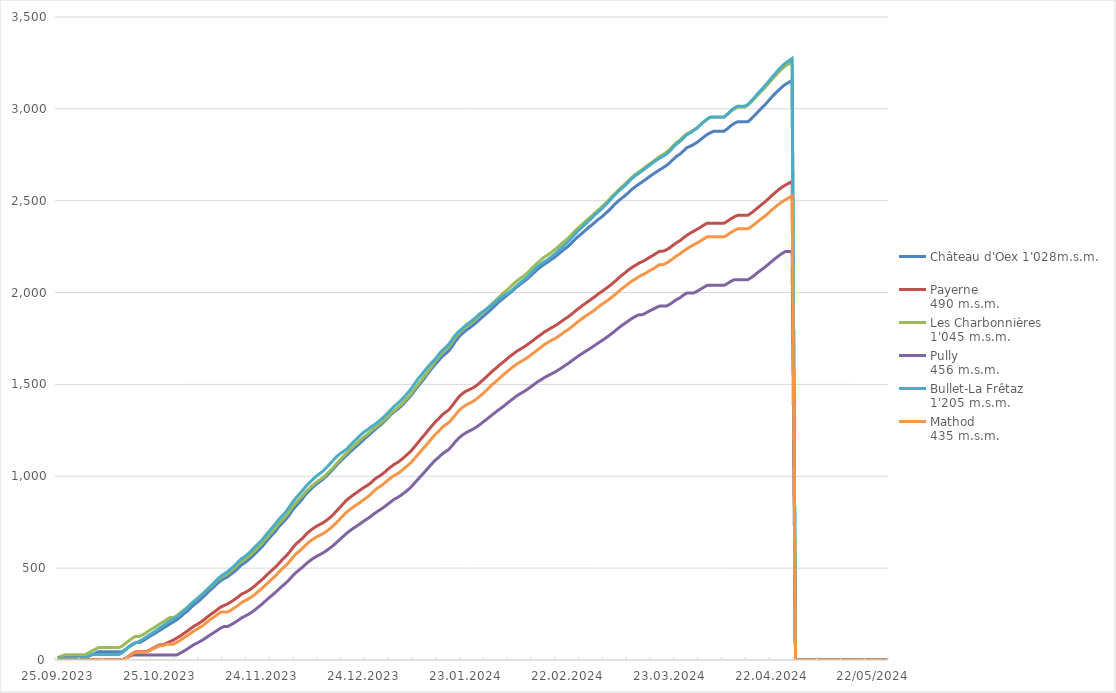
| Category | Château d'Oex 1'028m.s.m. | Payerne 
490 m.s.m. | Les Charbonnières 
1'045 m.s.m. | Pully 
456 m.s.m. | Bullet-La Frêtaz 
1'205 m.s.m. | Mathod 
435 m.s.m. |
|---|---|---|---|---|---|---|
| 25.09.2023 | 10.8 | 0 | 10.6 | 0 | 9.9 | 0 |
| 26.09.2023 | 19.4 | 0 | 19.9 | 0 | 9.9 | 0 |
| 27.09.2023 | 19.4 | 0 | 27.9 | 0 | 9.9 | 0 |
| 28.09.2023 | 19.4 | 0 | 27.9 | 0 | 9.9 | 0 |
| 29.09.2023 | 19.4 | 0 | 27.9 | 0 | 9.9 | 0 |
| 30.09.2023 | 19.4 | 0 | 27.9 | 0 | 9.9 | 0 |
| 01.10.2023 | 19.4 | 0 | 27.9 | 0 | 9.9 | 0 |
| 02.10.2023 | 19.4 | 0 | 27.9 | 0 | 9.9 | 0 |
| 03.10.2023 | 19.4 | 0 | 27.9 | 0 | 9.9 | 0 |
| 04.10.2023 | 19.4 | 0 | 38.4 | 0 | 20.1 | 0 |
| 05.10.2023 | 28.1 | 0 | 48.5 | 0 | 29.7 | 0 |
| 06.10.2023 | 36.7 | 0 | 58.1 | 0 | 29.7 | 0 |
| 07.10.2023 | 44.9 | 0 | 67.6 | 0 | 29.7 | 0 |
| 08.10.2023 | 44.9 | 0 | 67.6 | 0 | 29.7 | 0 |
| 09.10.2023 | 44.9 | 0 | 67.6 | 0 | 29.7 | 0 |
| 10.10.2023 | 44.9 | 0 | 67.6 | 0 | 29.7 | 0 |
| 11.10.2023 | 44.9 | 0 | 67.6 | 0 | 29.7 | 0 |
| 12.10.2023 | 44.9 | 0 | 67.6 | 0 | 29.7 | 0 |
| 13.10.2023 | 44.9 | 0 | 67.6 | 0 | 29.7 | 0 |
| 14.10.2023 | 44.9 | 0 | 76 | 0 | 39.4 | 0 |
| 15.10.2023 | 58.2 | 9.6 | 90.5 | 8.5 | 55 | 9 |
| 16.10.2023 | 73.2 | 22.5 | 106 | 19.1 | 71.7 | 20.8 |
| 17.10.2023 | 85.8 | 35.3 | 119.6 | 27.6 | 83.3 | 33.4 |
| 18.10.2023 | 95 | 45 | 128.4 | 27.6 | 92.9 | 42.3 |
| 19.10.2023 | 95 | 45 | 128.4 | 27.6 | 101.8 | 42.3 |
| 20.10.2023 | 104.3 | 45 | 137.3 | 27.6 | 112.2 | 42.3 |
| 21.10.2023 | 115.2 | 45 | 148.6 | 27.6 | 124.2 | 42.3 |
| 22.10.2023 | 128 | 53.7 | 161.3 | 27.6 | 137.3 | 50.9 |
| 23.10.2023 | 138.2 | 64.1 | 172.4 | 27.6 | 148.6 | 60.4 |
| 24.10.2023 | 149.7 | 73.2 | 184.1 | 27.6 | 161.2 | 68.8 |
| 25.10.2023 | 161.7 | 82.6 | 196.1 | 27.6 | 174.4 | 77.8 |
| 26.10.2023 | 172.6 | 82.6 | 206.7 | 27.6 | 186.3 | 77.8 |
| 27.10.2023 | 184.7 | 91.3 | 219.6 | 27.6 | 200.5 | 86 |
| 28.10.2023 | 196.2 | 99.8 | 230.9 | 27.6 | 212.7 | 86 |
| 29.10.2023 | 207.2 | 108.3 | 230.9 | 27.6 | 222.3 | 86 |
| 30.10.2023 | 219.2 | 119.4 | 241.4 | 27.6 | 234.1 | 96.4 |
| 31.10.2023 | 233.5 | 130.1 | 255.9 | 36.8 | 249.4 | 106.8 |
| 01.11.2023 | 249.7 | 143.5 | 270.9 | 47.8 | 265 | 120.1 |
| 02.11.2023 | 264.2 | 156 | 284.8 | 58.3 | 280.7 | 131.7 |
| 03.11.2023 | 281.8 | 169.6 | 302.9 | 70.9 | 299.9 | 144.8 |
| 04.11.2023 | 299.4 | 183.1 | 318.8 | 82.9 | 317.5 | 157.4 |
| 05.11.2023 | 313.8 | 193.9 | 333.1 | 92.2 | 333.1 | 167.6 |
| 06.11.2023 | 329.3 | 205.5 | 348.6 | 102.1 | 349.3 | 178.8 |
| 07.11.2023 | 347 | 218.7 | 366 | 113.3 | 367.3 | 192.4 |
| 08.11.2023 | 365.6 | 233.9 | 382.8 | 126.2 | 384.8 | 208 |
| 09.11.2023 | 382.7 | 248.2 | 397.8 | 138.4 | 402 | 221.9 |
| 10.11.2023 | 399.3 | 260.9 | 415 | 149.8 | 420.3 | 234 |
| 11.11.2023 | 417 | 275.2 | 433.6 | 162.3 | 440 | 248.1 |
| 12.11.2023 | 432.9 | 288.9 | 448.8 | 174.2 | 456.9 | 261.2 |
| 13.11.2023 | 443.8 | 297.2 | 459.2 | 182.8 | 468.9 | 261.2 |
| 14.11.2023 | 453.4 | 305.6 | 470 | 182.8 | 481.5 | 261.2 |
| 15.11.2023 | 467.7 | 316.9 | 485.5 | 192.1 | 497.5 | 271.8 |
| 16.11.2023 | 481.8 | 329.2 | 500.8 | 203 | 513.8 | 284.1 |
| 17.11.2023 | 498.4 | 342 | 518.5 | 214.4 | 532.8 | 296.3 |
| 18.11.2023 | 516.8 | 357.8 | 535.4 | 228.3 | 550.5 | 311.7 |
| 19.11.2023 | 529.4 | 366.4 | 546.7 | 238.2 | 562.7 | 321.8 |
| 20.11.2023 | 543.7 | 376.6 | 560.9 | 247.8 | 578.2 | 331.4 |
| 21.11.2023 | 560 | 389.2 | 577.7 | 259.4 | 596.2 | 343.2 |
| 22.11.2023 | 577.1 | 403.8 | 595.5 | 272.7 | 615.8 | 356.6 |
| 23.11.2023 | 596.2 | 420.6 | 614.4 | 287.9 | 632.4 | 373.1 |
| 24.11.2023 | 614.2 | 435.7 | 632.9 | 302.7 | 651.4 | 388.8 |
| 25.11.2023 | 636.1 | 453.4 | 655.1 | 319.5 | 674.6 | 405.6 |
| 26.11.2023 | 659.6 | 471.5 | 677 | 336.1 | 697.2 | 423.7 |
| 27.11.2023 | 679.6 | 488.5 | 697.6 | 351.7 | 718.3 | 441 |
| 28.11.2023 | 699.2 | 504.9 | 718.4 | 367.1 | 740.3 | 457.1 |
| 29.11.2023 | 724.5 | 524.8 | 742.7 | 385 | 764.8 | 476.9 |
| 30.11.2023 | 744.4 | 544.5 | 761.8 | 401.7 | 784.6 | 495.8 |
| 01.12.2023 | 763.8 | 562.9 | 781.2 | 417.1 | 804.6 | 513.1 |
| 02.12.2023 | 786.1 | 583.2 | 805.1 | 435.5 | 829.7 | 532 |
| 03.12.2023 | 813.9 | 607.4 | 832.7 | 455.8 | 857.2 | 554.1 |
| 04.12.2023 | 836.8 | 629.8 | 854 | 474.9 | 880.5 | 575.4 |
| 05.12.2023 | 856 | 646.1 | 873.7 | 489.9 | 901.4 | 591.6 |
| 06.12.2023 | 878.1 | 662.5 | 894 | 505.1 | 923.1 | 608.1 |
| 07.12.2023 | 902.9 | 682.7 | 916.1 | 522.4 | 945.3 | 626.7 |
| 08.12.2023 | 922.1 | 700 | 934.1 | 537.8 | 964.3 | 643.3 |
| 09.12.2023 | 939.8 | 714.5 | 951.2 | 551.4 | 982.5 | 656.9 |
| 10.12.2023 | 956.4 | 726.6 | 966.9 | 562.6 | 999.4 | 668.4 |
| 11.12.2023 | 969 | 736.8 | 979.6 | 572.7 | 1013.8 | 678.1 |
| 12.12.2023 | 983.4 | 746.4 | 992.3 | 582.4 | 1028 | 687.4 |
| 13.12.2023 | 1000.9 | 759.5 | 1009.4 | 594.7 | 1046.2 | 699.8 |
| 14.12.2023 | 1019.5 | 773.7 | 1028.2 | 608.2 | 1065.9 | 713.6 |
| 15.12.2023 | 1038.6 | 790.9 | 1047.7 | 622.6 | 1086.6 | 730.3 |
| 16.12.2023 | 1059.8 | 811.3 | 1067.9 | 639.3 | 1106.9 | 748.8 |
| 17.12.2023 | 1079.1 | 830.7 | 1087.8 | 656.5 | 1122 | 767.3 |
| 18.12.2023 | 1097.2 | 850.9 | 1108 | 673.1 | 1134.9 | 787 |
| 19.12.2023 | 1114.7 | 870.5 | 1127 | 689.8 | 1148.5 | 805.2 |
| 20.12.2023 | 1132.5 | 885.7 | 1146 | 704.4 | 1168.4 | 820.2 |
| 21.12.2023 | 1149.6 | 899.4 | 1163.4 | 717.8 | 1186.8 | 833.6 |
| 22.12.2023 | 1165.4 | 912.1 | 1179.9 | 729.5 | 1204.6 | 845.7 |
| 23.12.2023 | 1182.4 | 925.7 | 1197.8 | 742.3 | 1223.5 | 858.9 |
| 24.12.2023 | 1200.4 | 938.6 | 1213 | 755.9 | 1239.6 | 872.8 |
| 25.12.2023 | 1215.5 | 949.3 | 1227.3 | 767.5 | 1252.3 | 885.6 |
| 26.12.2023 | 1232.3 | 962.7 | 1243.7 | 780.5 | 1266.2 | 901 |
| 27.12.2023 | 1249.1 | 981.1 | 1260.4 | 795.5 | 1278.9 | 919.9 |
| 28.12.2023 | 1265.9 | 994.1 | 1274.2 | 808.2 | 1292.6 | 935.4 |
| 29.12.2023 | 1279.7 | 1005.2 | 1288.6 | 819.8 | 1308.3 | 946.8 |
| 30.12.2023 | 1297.2 | 1019.4 | 1305.5 | 832.9 | 1324.7 | 961.1 |
| 31.12.2023 | 1315.8 | 1036.7 | 1322.5 | 847.1 | 1343.3 | 977 |
| 01.01.2024 | 1335.6 | 1051.6 | 1341.5 | 861.2 | 1362.9 | 991.8 |
| 02.01.2024 | 1352.3 | 1065.4 | 1358.4 | 875.1 | 1380.9 | 1004.8 |
| 03.01.2024 | 1365.2 | 1075.8 | 1373.1 | 885.1 | 1396.7 | 1014.7 |
| 04.01.2024 | 1381.7 | 1089.1 | 1390.5 | 897.1 | 1414.8 | 1028 |
| 05.01.2024 | 1400.9 | 1105.5 | 1408.3 | 911 | 1433.5 | 1044.3 |
| 06.01.2024 | 1421 | 1121.7 | 1428.6 | 926.1 | 1455 | 1059.7 |
| 07.01.2024 | 1441.4 | 1139.2 | 1449.7 | 942.7 | 1477.3 | 1076.1 |
| 08.01.2024 | 1466 | 1161.4 | 1475.6 | 963.9 | 1504.5 | 1097.6 |
| 09.01.2024 | 1490.8 | 1184 | 1501.4 | 984.7 | 1531.1 | 1119.4 |
| 10.01.2024 | 1512.9 | 1206.6 | 1524 | 1004.4 | 1552.8 | 1140.5 |
| 11.01.2024 | 1537.1 | 1228.4 | 1548.7 | 1025.2 | 1576.1 | 1161.2 |
| 12.01.2024 | 1562.8 | 1251 | 1572.4 | 1046.4 | 1598.6 | 1182.7 |
| 13.01.2024 | 1587 | 1273.4 | 1598.6 | 1067 | 1619.2 | 1205.3 |
| 14.01.2024 | 1608.7 | 1294.7 | 1624.2 | 1086.5 | 1637.8 | 1226.7 |
| 15.01.2024 | 1628.7 | 1312.2 | 1646.9 | 1102.4 | 1661.3 | 1244.2 |
| 16.01.2024 | 1650.9 | 1332.5 | 1672.2 | 1119.7 | 1683.8 | 1264.3 |
| 17.01.2024 | 1665.7 | 1347.8 | 1687 | 1133 | 1699.6 | 1279.5 |
| 18.01.2024 | 1682.1 | 1361.3 | 1704 | 1145.9 | 1718 | 1292.2 |
| 19.01.2024 | 1706.8 | 1383.3 | 1729.4 | 1166.5 | 1744.5 | 1312.2 |
| 20.01.2024 | 1734.5 | 1408.7 | 1755.4 | 1189 | 1769.4 | 1334.8 |
| 21.01.2024 | 1758.5 | 1432.9 | 1779.3 | 1208.7 | 1788.7 | 1357.3 |
| 22.01.2024 | 1776.8 | 1449.7 | 1795.6 | 1223.9 | 1804.5 | 1374.2 |
| 23.01.2024 | 1793.1 | 1462.4 | 1812.5 | 1236.2 | 1822.1 | 1386.9 |
| 24.01.2024 | 1806.1 | 1470.9 | 1825.4 | 1245.8 | 1835.7 | 1396.9 |
| 25.01.2024 | 1819.9 | 1479.8 | 1838.7 | 1255.1 | 1849.9 | 1406 |
| 26.01.2024 | 1835.1 | 1491.3 | 1854 | 1266.1 | 1864.8 | 1417.9 |
| 27.01.2024 | 1851.2 | 1506.7 | 1872.2 | 1279.2 | 1882.4 | 1433.4 |
| 28.01.2024 | 1868.3 | 1522.7 | 1890.6 | 1293.6 | 1896 | 1449 |
| 29.01.2024 | 1884.2 | 1540 | 1907.3 | 1308.2 | 1908.6 | 1466.5 |
| 30.01.2024 | 1900.6 | 1557.3 | 1925.2 | 1322.5 | 1922.3 | 1484.1 |
| 31.01.2024 | 1917.6 | 1574.7 | 1943.7 | 1337.3 | 1936.5 | 1502.5 |
| 01.02.2024 | 1935.6 | 1589.9 | 1960.7 | 1351.7 | 1952.8 | 1518 |
| 02.02.2024 | 1952.9 | 1606 | 1978 | 1365.5 | 1968.5 | 1534.6 |
| 03.02.2024 | 1967.8 | 1621.4 | 1995.4 | 1379.3 | 1980.4 | 1551 |
| 04.02.2024 | 1982.7 | 1636.6 | 2012 | 1393.8 | 1992.2 | 1566.6 |
| 05.02.2024 | 1997.8 | 1652.3 | 2028.5 | 1409.3 | 2003.8 | 1582.3 |
| 06.02.2024 | 2013.6 | 1666.1 | 2046.5 | 1423.3 | 2019.4 | 1596.7 |
| 07.02.2024 | 2030.7 | 1679.9 | 2062.8 | 1437.4 | 2037.4 | 1610.6 |
| 08.02.2024 | 2044.7 | 1691.2 | 2076.1 | 1449.2 | 2052.6 | 1621.9 |
| 09.02.2024 | 2058.2 | 1702 | 2089.4 | 1459.7 | 2067.4 | 1632.5 |
| 10.02.2024 | 2072.8 | 1714.7 | 2104.6 | 1471.5 | 2083.1 | 1644.5 |
| 11.02.2024 | 2089.8 | 1728.4 | 2123 | 1485.1 | 2102.6 | 1658.1 |
| 12.02.2024 | 2106.9 | 1742 | 2141.2 | 1498.5 | 2121.5 | 1671.5 |
| 13.02.2024 | 2124.5 | 1756.8 | 2159.9 | 1512 | 2139.8 | 1686.4 |
| 14.02.2024 | 2138.9 | 1769.5 | 2175.7 | 1523.7 | 2153.7 | 1700.2 |
| 15.02.2024 | 2152.7 | 1783.8 | 2192 | 1535.8 | 2166.4 | 1715.4 |
| 16.02.2024 | 2165 | 1795 | 2203.1 | 1545.9 | 2178 | 1726.7 |
| 17.02.2024 | 2177.7 | 1806 | 2216.6 | 1555.2 | 2191.8 | 1737.6 |
| 18.02.2024 | 2190.1 | 1816.3 | 2230.8 | 1564.8 | 2207 | 1747.4 |
| 19.02.2024 | 2204.6 | 1827.4 | 2245.6 | 1575.7 | 2223.1 | 1758.1 |
| 20.02.2024 | 2221.1 | 1840.7 | 2262.9 | 1587.7 | 2241.5 | 1770.7 |
| 21.02.2024 | 2236.3 | 1854.4 | 2278.9 | 1600.4 | 2257.6 | 1785.4 |
| 22.02.2024 | 2249.4 | 1866 | 2294 | 1612.1 | 2274.3 | 1796.4 |
| 23.02.2024 | 2267.3 | 1880.7 | 2313.3 | 1625.9 | 2294.7 | 1810.9 |
| 24.02.2024 | 2285.9 | 1895.7 | 2332.6 | 1639.4 | 2314.9 | 1826.3 |
| 25.02.2024 | 2303.9 | 1910.9 | 2350.3 | 1653 | 2334.1 | 1841.6 |
| 26.02.2024 | 2319.3 | 1924.6 | 2366.3 | 1665.3 | 2352 | 1855.3 |
| 27.02.2024 | 2335.9 | 1938.7 | 2384 | 1677.3 | 2369.9 | 1869 |
| 28.02.2024 | 2351.6 | 1951.3 | 2400.4 | 1688.8 | 2387.7 | 1880.8 |
| 29.02.2024 | 2366.5 | 1964.4 | 2416.1 | 1700.6 | 2404.9 | 1893.3 |
| 01.03.2024 | 2382.6 | 1977.8 | 2433.5 | 1713 | 2422.7 | 1906.5 |
| 02.03.2024 | 2398.4 | 1992.9 | 2449.3 | 1725.7 | 2439.6 | 1922.3 |
| 03.03.2024 | 2412.1 | 2005.7 | 2466.2 | 1737.6 | 2455.7 | 1935.3 |
| 04.03.2024 | 2428.4 | 2018.6 | 2484.2 | 1750.4 | 2474.3 | 1947.8 |
| 05.03.2024 | 2445.3 | 2032 | 2502.6 | 1763.5 | 2493.5 | 1961 |
| 06.03.2024 | 2464.3 | 2046.8 | 2522 | 1777.8 | 2514 | 1975.2 |
| 07.03.2024 | 2483.4 | 2062.6 | 2540.8 | 1792.4 | 2534.8 | 1990 |
| 08.03.2024 | 2500.8 | 2080 | 2559.4 | 1808 | 2552.6 | 2006.7 |
| 09.03.2024 | 2515.3 | 2095.5 | 2576.1 | 1822.1 | 2568.5 | 2022.1 |
| 10.03.2024 | 2529.4 | 2109.7 | 2593.3 | 1834.6 | 2585.1 | 2035.5 |
| 11.03.2024 | 2547.1 | 2124.7 | 2612.2 | 1847.8 | 2603.5 | 2050.9 |
| 12.03.2024 | 2563.8 | 2138 | 2629.7 | 1860.4 | 2622.2 | 2064 |
| 13.03.2024 | 2578.3 | 2148.9 | 2644.8 | 1870.7 | 2637.9 | 2075 |
| 14.03.2024 | 2590.9 | 2160.8 | 2658.1 | 1879.9 | 2650.4 | 2087.5 |
| 15.03.2024 | 2603.5 | 2169 | 2670.8 | 1879.9 | 2663.2 | 2096.8 |
| 16.03.2024 | 2616.7 | 2178.7 | 2685.1 | 1888.9 | 2677.9 | 2105.8 |
| 17.03.2024 | 2630.5 | 2191.2 | 2699.7 | 1899.5 | 2692.2 | 2118.2 |
| 18.03.2024 | 2643.1 | 2201.3 | 2712.3 | 1908.4 | 2705.9 | 2127.4 |
| 19.03.2024 | 2655.8 | 2213.4 | 2726.5 | 1918 | 2719.7 | 2140.1 |
| 20.03.2024 | 2667.7 | 2224.4 | 2739.8 | 1926.4 | 2731.2 | 2151.7 |
| 21.03.2024 | 2679.4 | 2224.4 | 2751.2 | 1926.4 | 2741.9 | 2151.7 |
| 22.03.2024 | 2691 | 2232.7 | 2763.3 | 1926.4 | 2752.8 | 2160.3 |
| 23.03.2024 | 2705.9 | 2243.5 | 2779.5 | 1935.8 | 2769.5 | 2171.5 |
| 24.03.2024 | 2724.3 | 2257.6 | 2799 | 1948.8 | 2790 | 2185.7 |
| 25.03.2024 | 2741.5 | 2271.4 | 2817 | 1961.9 | 2808.5 | 2199.9 |
| 26.03.2024 | 2753.2 | 2282 | 2830.1 | 1971.5 | 2821.9 | 2210.1 |
| 27.03.2024 | 2770.4 | 2297.1 | 2848.4 | 1985.6 | 2840.9 | 2224.7 |
| 28.03.2024 | 2787.7 | 2311.2 | 2864.3 | 1997.1 | 2858.3 | 2238.1 |
| 29.03.2024 | 2796.6 | 2322.9 | 2872.5 | 1997.1 | 2868.9 | 2249.1 |
| 30.03.2024 | 2805.6 | 2333.4 | 2884.5 | 1997.1 | 2881.1 | 2259.4 |
| 31.03.2024 | 2817 | 2344 | 2896.7 | 2006.6 | 2894.6 | 2269.3 |
| 01.04.2024 | 2831.3 | 2355.1 | 2912.9 | 2017.7 | 2911.9 | 2280.5 |
| 02.04.2024 | 2846.1 | 2366.6 | 2929 | 2028.6 | 2928.5 | 2292.2 |
| 03.04.2024 | 2860 | 2377.8 | 2943 | 2039.2 | 2944.1 | 2303.5 |
| 04.04.2024 | 2870.3 | 2377.8 | 2954 | 2039.2 | 2956.1 | 2303.5 |
| 05.04.2024 | 2878.5 | 2377.8 | 2954 | 2039.2 | 2956.1 | 2303.5 |
| 06.04.2024 | 2878.5 | 2377.8 | 2954 | 2039.2 | 2956.1 | 2303.5 |
| 07.04.2024 | 2878.5 | 2377.8 | 2954 | 2039.2 | 2956.1 | 2303.5 |
| 08.04.2024 | 2878.5 | 2377.8 | 2954 | 2039.2 | 2956.1 | 2303.5 |
| 09.04.2024 | 2892.2 | 2388.6 | 2969.8 | 2049.4 | 2972.6 | 2313.9 |
| 10.04.2024 | 2908.5 | 2401.7 | 2986.7 | 2060.9 | 2990.7 | 2326.9 |
| 11.04.2024 | 2920.9 | 2412.4 | 2999.9 | 2070.2 | 3005 | 2338 |
| 12.04.2024 | 2930 | 2420.6 | 3010.3 | 2070.2 | 3014.5 | 2346.8 |
| 13.04.2024 | 2930 | 2420.6 | 3010.3 | 2070.2 | 3014.5 | 2346.8 |
| 14.04.2024 | 2930 | 2420.6 | 3010.3 | 2070.2 | 3014.5 | 2346.8 |
| 15.04.2024 | 2930 | 2420.6 | 3020 | 2070.2 | 3024 | 2346.8 |
| 16.04.2024 | 2945.7 | 2432.9 | 3037.9 | 2081.6 | 3043 | 2358.8 |
| 17.04.2024 | 2964.8 | 2447.6 | 3057.3 | 2095.8 | 3063.6 | 2372.9 |
| 18.04.2024 | 2984.4 | 2463.4 | 3077.3 | 2110.5 | 3085 | 2387.9 |
| 19.04.2024 | 3003.7 | 2478.7 | 3096.9 | 2124.4 | 3105 | 2402.8 |
| 20.04.2024 | 3021.9 | 2493.2 | 3116 | 2138.2 | 3125.4 | 2416.1 |
| 21.04.2024 | 3042.4 | 2510.1 | 3136.7 | 2153.5 | 3147.2 | 2432.6 |
| 22.04.2024 | 3063.7 | 2527.7 | 3158.4 | 2169.8 | 3170 | 2449.7 |
| 23.04.2024 | 3082.6 | 2543.8 | 3178.3 | 2184.8 | 3191.4 | 2464.4 |
| 24.04.2024 | 3101.1 | 2559.3 | 3198.9 | 2199 | 3212.4 | 2479.7 |
| 25.04.2024 | 3118.5 | 2573.2 | 3217.1 | 2212.3 | 3232 | 2493.5 |
| 26.04.2024 | 3133 | 2584.8 | 3232.5 | 2223.1 | 3248.5 | 2505 |
| 27.04.2024 | 3144.1 | 2594.5 | 3244.6 | 2223.1 | 3260.8 | 2515 |
| 28.04.2024 | 3155 | 2605 | 3258.4 | 2223.1 | 3274.6 | 2525.5 |
| 29/04/2024 | 0 | 0 | 0 | 0 | 0 | 0 |
| 30/04/2024 | 0 | 0 | 0 | 0 | 0 | 0 |
| 01/05/2024 | 0 | 0 | 0 | 0 | 0 | 0 |
| 02/05/2024 | 0 | 0 | 0 | 0 | 0 | 0 |
| 03/05/2024 | 0 | 0 | 0 | 0 | 0 | 0 |
| 04/05/2024 | 0 | 0 | 0 | 0 | 0 | 0 |
| 05/05/2024 | 0 | 0 | 0 | 0 | 0 | 0 |
| 06/05/2024 | 0 | 0 | 0 | 0 | 0 | 0 |
| 07/05/2024 | 0 | 0 | 0 | 0 | 0 | 0 |
| 08/05/2024 | 0 | 0 | 0 | 0 | 0 | 0 |
| 09/05/2024 | 0 | 0 | 0 | 0 | 0 | 0 |
| 10/05/2024 | 0 | 0 | 0 | 0 | 0 | 0 |
| 11/05/2024 | 0 | 0 | 0 | 0 | 0 | 0 |
| 12/05/2024 | 0 | 0 | 0 | 0 | 0 | 0 |
| 13/05/2024 | 0 | 0 | 0 | 0 | 0 | 0 |
| 14/05/2024 | 0 | 0 | 0 | 0 | 0 | 0 |
| 15/05/2024 | 0 | 0 | 0 | 0 | 0 | 0 |
| 16/05/2024 | 0 | 0 | 0 | 0 | 0 | 0 |
| 17/05/2024 | 0 | 0 | 0 | 0 | 0 | 0 |
| 18/05/2024 | 0 | 0 | 0 | 0 | 0 | 0 |
| 19/05/2024 | 0 | 0 | 0 | 0 | 0 | 0 |
| 20/05/2024 | 0 | 0 | 0 | 0 | 0 | 0 |
| 21/05/2024 | 0 | 0 | 0 | 0 | 0 | 0 |
| 22/05/2024 | 0 | 0 | 0 | 0 | 0 | 0 |
| 23/05/2024 | 0 | 0 | 0 | 0 | 0 | 0 |
| 24/05/2024 | 0 | 0 | 0 | 0 | 0 | 0 |
| 25/05/2024 | 0 | 0 | 0 | 0 | 0 | 0 |
| 26/05/2024 | 0 | 0 | 0 | 0 | 0 | 0 |